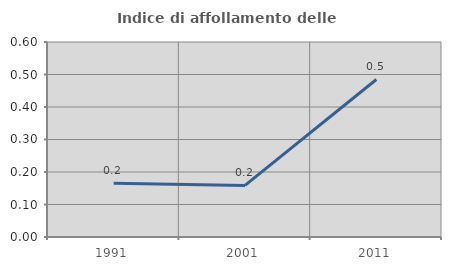
| Category | Indice di affollamento delle abitazioni  |
|---|---|
| 1991.0 | 0.165 |
| 2001.0 | 0.159 |
| 2011.0 | 0.485 |